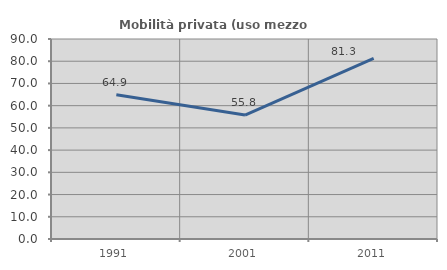
| Category | Mobilità privata (uso mezzo privato) |
|---|---|
| 1991.0 | 64.865 |
| 2001.0 | 55.789 |
| 2011.0 | 81.25 |